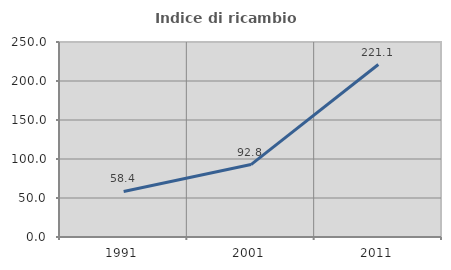
| Category | Indice di ricambio occupazionale  |
|---|---|
| 1991.0 | 58.403 |
| 2001.0 | 92.843 |
| 2011.0 | 221.12 |